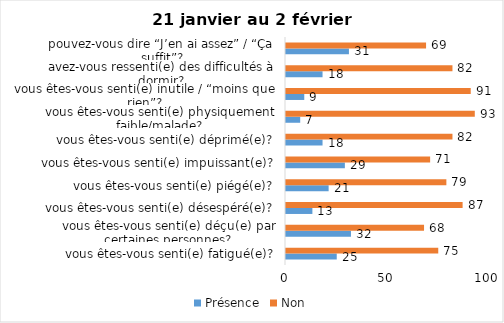
| Category | Présence | Non |
|---|---|---|
| vous êtes-vous senti(e) fatigué(e)? | 25 | 75 |
| vous êtes-vous senti(e) déçu(e) par certaines personnes? | 32 | 68 |
| vous êtes-vous senti(e) désespéré(e)? | 13 | 87 |
| vous êtes-vous senti(e) piégé(e)? | 21 | 79 |
| vous êtes-vous senti(e) impuissant(e)? | 29 | 71 |
| vous êtes-vous senti(e) déprimé(e)? | 18 | 82 |
| vous êtes-vous senti(e) physiquement faible/malade? | 7 | 93 |
| vous êtes-vous senti(e) inutile / “moins que rien”? | 9 | 91 |
| avez-vous ressenti(e) des difficultés à dormir? | 18 | 82 |
| pouvez-vous dire “J’en ai assez” / “Ça suffit”? | 31 | 69 |